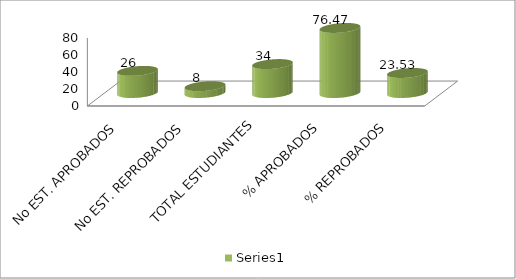
| Category | Series 0 |
|---|---|
| No EST. APROBADOS | 26 |
| No EST. REPROBADOS | 8 |
| TOTAL ESTUDIANTES | 34 |
| % APROBADOS | 76.471 |
| % REPROBADOS | 23.529 |